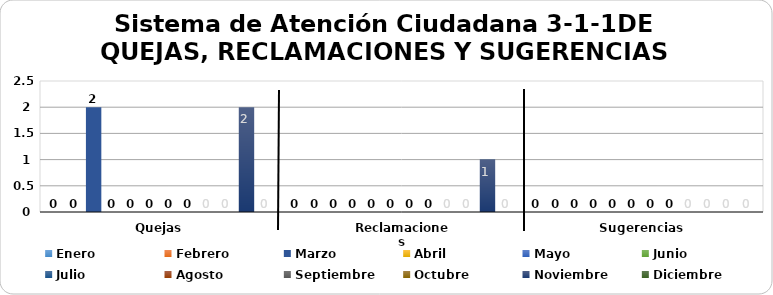
| Category | Enero | Febrero | Marzo | Abril | Mayo | Junio | Julio | Agosto | Septiembre | Octubre | Noviembre | Diciembre |
|---|---|---|---|---|---|---|---|---|---|---|---|---|
| Quejas | 0 | 0 | 2 | 0 | 0 | 0 | 0 | 0 | 0 | 0 | 2 | 0 |
| Reclamaciones | 0 | 0 | 0 | 0 | 0 | 0 | 0 | 0 | 0 | 0 | 1 | 0 |
| Sugerencias | 0 | 0 | 0 | 0 | 0 | 0 | 0 | 0 | 0 | 0 | 0 | 0 |